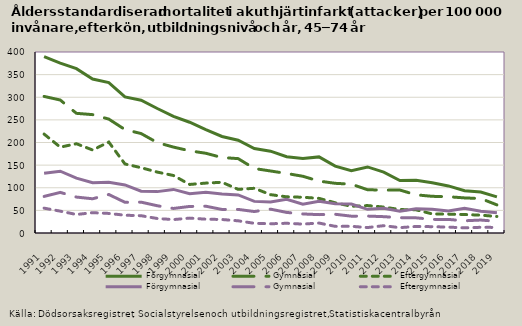
| Category | Förgymnasial | Gymnasial | Eftergymnasial | Eftergymnasial  |
|---|---|---|---|---|
| 1991.0 | 131.894 | 80.821 | 218.561 | 54.891 |
| 1992.0 | 136.595 | 89.733 | 189.757 | 48.28 |
| 1993.0 | 121.329 | 79.395 | 197.285 | 40.899 |
| 1994.0 | 111.092 | 75.638 | 183.447 | 44.893 |
| 1995.0 | 112.271 | 85.082 | 200.976 | 43.264 |
| 1996.0 | 106.201 | 67.873 | 152.57 | 39.308 |
| 1997.0 | 92.514 | 68.19 | 144.316 | 38.218 |
| 1998.0 | 91.454 | 60.221 | 134.63 | 32.037 |
| 1999.0 | 96.314 | 54.223 | 127.076 | 29.661 |
| 2000.0 | 86.98 | 58.682 | 107.278 | 32.886 |
| 2001.0 | 90.158 | 59.203 | 110.272 | 30.538 |
| 2002.0 | 86.124 | 52.03 | 112.103 | 29.824 |
| 2003.0 | 84.115 | 52.153 | 96.457 | 26.93 |
| 2004.0 | 69.89 | 47.414 | 98.804 | 21.37 |
| 2005.0 | 68.741 | 52.716 | 84.777 | 20.426 |
| 2006.0 | 74.644 | 45.48 | 79.924 | 21.455 |
| 2007.0 | 63.637 | 42.073 | 79.04 | 19.708 |
| 2008.0 | 70.335 | 40.593 | 76.522 | 21.963 |
| 2009.0 | 64.78 | 41.413 | 66.779 | 14.696 |
| 2010.0 | 64.098 | 37.199 | 59.097 | 14.765 |
| 2011.0 | 52.296 | 37.406 | 60.646 | 11.998 |
| 2012.0 | 54.449 | 36.104 | 57.29 | 16.155 |
| 2013.0 | 48.313 | 33.858 | 51.81 | 11.848 |
| 2014.0 | 53.694 | 33.529 | 51.172 | 14.433 |
| 2015.0 | 52.513 | 30.053 | 42.2 | 14.009 |
| 2016.0 | 48.4 | 30.017 | 41.705 | 12.995 |
| 2017.0 | 54.722 | 27.018 | 40.817 | 11.339 |
| 2018.0 | 47.897 | 28.615 | 39.426 | 12.596 |
| 2019.0 | 44.92 | 25.763 | 36.525 | 12.328 |